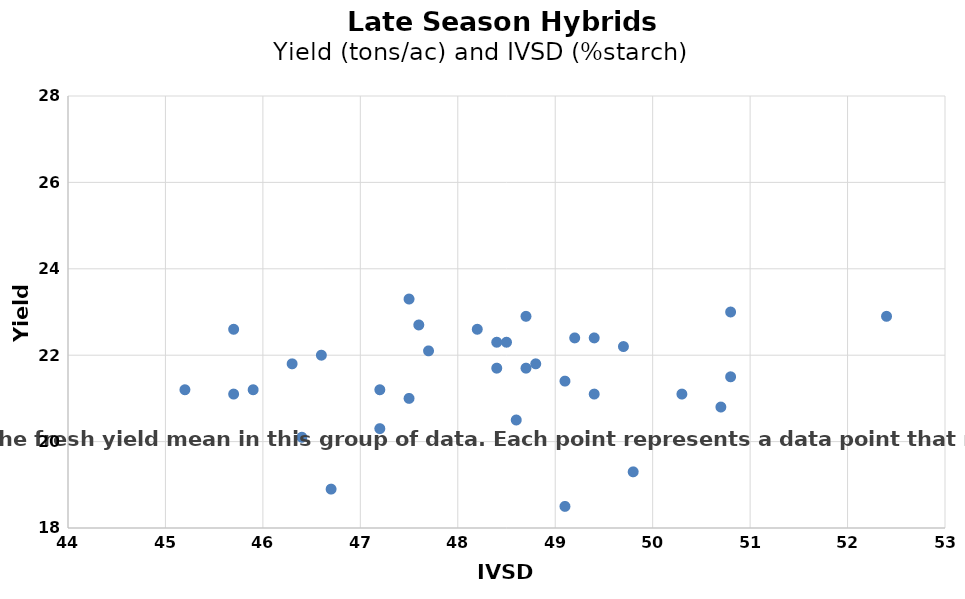
| Category | Series 0 |
|---|---|
| 47.6 | 22.7 |
| 47.2 | 21.2 |
| 45.7 | 22.6 |
| 48.2 | 22.6 |
| 49.1 | 21.4 |
| 48.7 | 22.9 |
| 49.4 | 21.1 |
| 49.2 | 22.4 |
| 48.4 | 21.7 |
| 45.9 | 21.2 |
| 47.5 | 21 |
| 49.4 | 22.4 |
| 45.7 | 21.1 |
| 50.8 | 23 |
| 46.7 | 18.9 |
| 46.6 | 22 |
| 48.7 | 21.7 |
| 50.8 | 21.5 |
| 47.7 | 22.1 |
| 48.4 | 22.3 |
| 46.4 | 20.1 |
| 47.5 | 23.3 |
| 45.2 | 21.2 |
| 52.4 | 22.9 |
| 48.5 | 22.3 |
| 46.3 | 21.8 |
| 49.7 | 22.2 |
| 47.2 | 20.3 |
| 50.3 | 21.1 |
| 48.8 | 21.8 |
| 48.6 | 20.5 |
| 49.1 | 18.5 |
| 49.8 | 19.3 |
| 50.7 | 20.8 |